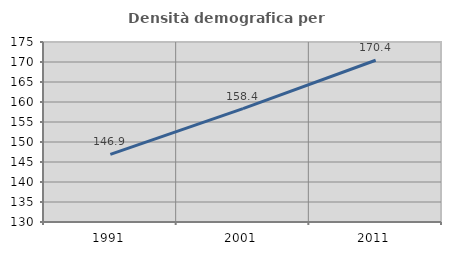
| Category | Densità demografica |
|---|---|
| 1991.0 | 146.921 |
| 2001.0 | 158.354 |
| 2011.0 | 170.443 |